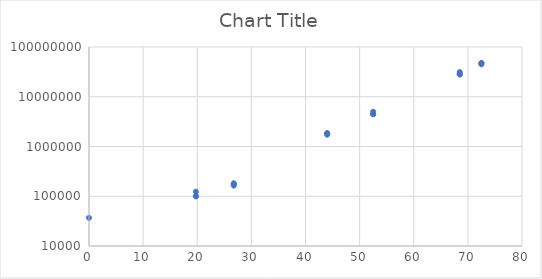
| Category | Series 0 |
|---|---|
| 0.0 | 36832.902 |
| 19.75 | 123317.672 |
| 19.75 | 99148.844 |
| 19.75 | 101272.12 |
| 26.750000000000004 | 163726.461 |
| 26.750000000000004 | 182431.211 |
| 26.750000000000004 | 174801.319 |
| 44.0 | 1723467.549 |
| 44.0 | 1867070.866 |
| 44.0 | 1816746.983 |
| 52.5 | 4463616.141 |
| 52.5 | 4463453.515 |
| 52.5 | 4998753.822 |
| 68.5 | 28390019.056 |
| 68.5 | 28009135.256 |
| 68.5 | 31359493.418 |
| 72.5 | 44770809.876 |
| 72.5 | 46931686.074 |
| 72.5 | 47762625.415 |